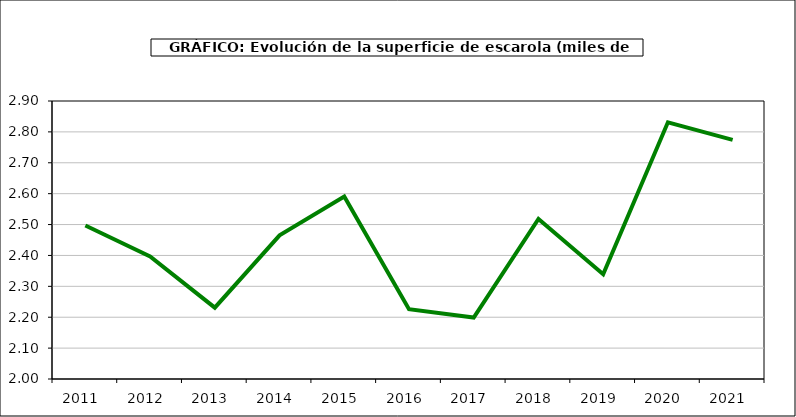
| Category | superficie |
|---|---|
| 2011.0 | 2.497 |
| 2012.0 | 2.397 |
| 2013.0 | 2.231 |
| 2014.0 | 2.465 |
| 2015.0 | 2.591 |
| 2016.0 | 2.226 |
| 2017.0 | 2.199 |
| 2018.0 | 2.518 |
| 2019.0 | 2.339 |
| 2020.0 | 2.831 |
| 2021.0 | 2.774 |